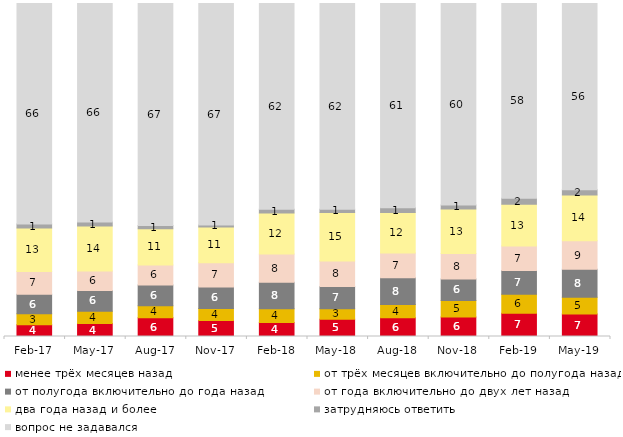
| Category | менее трёх месяцев назад | от трёх месяцев включительно до полугода назад | от полугода включительно до года назад | от года включительно до двух лет назад | два года назад и более | затрудняюсь ответить | вопрос не задавался |
|---|---|---|---|---|---|---|---|
| 2017-02-01 | 3.55 | 3.25 | 5.9 | 6.8 | 13.1 | 1.15 | 66.25 |
| 2017-05-01 | 3.9 | 3.65 | 6.3 | 5.8 | 13.5 | 1.25 | 65.6 |
| 2017-08-01 | 5.65 | 3.6 | 6.25 | 6 | 10.85 | 0.95 | 66.7 |
| 2017-11-01 | 4.8 | 3.6 | 6.45 | 7.3 | 10.75 | 0.6 | 66.5 |
| 2018-02-01 | 4.2 | 4.1 | 8 | 8.45 | 12.35 | 1.1 | 61.8 |
| 2018-05-01 | 5.2 | 3.15 | 6.65 | 7.7 | 14.5 | 1 | 61.8 |
| 2018-08-01 | 5.6 | 4 | 8.05 | 7.45 | 12.15 | 1.45 | 61.3 |
| 2018-11-01 | 5.888 | 4.94 | 6.437 | 7.635 | 13.373 | 1.248 | 60.479 |
| 2019-02-01 | 6.95 | 5.75 | 7.15 | 7.35 | 12.5 | 1.85 | 58.45 |
| 2019-05-01 | 6.786 | 5.002 | 8.37 | 8.569 | 13.769 | 1.535 | 55.968 |